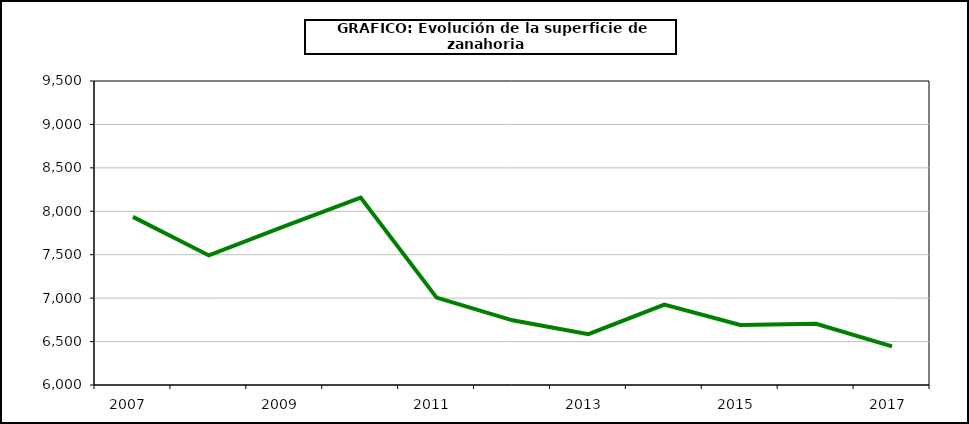
| Category | superficie |
|---|---|
| 2007.0 | 7936 |
| 2008.0 | 7492 |
| 2009.0 | 7828 |
| 2010.0 | 8157 |
| 2011.0 | 7006 |
| 2012.0 | 6745 |
| 2013.0 | 6586 |
| 2014.0 | 6926 |
| 2015.0 | 6692 |
| 2016.0 | 6705 |
| 2017.0 | 6444 |